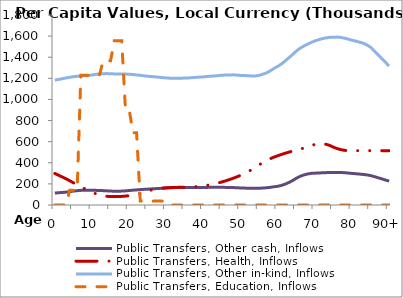
| Category | Public Transfers, Other cash, Inflows | Public Transfers, Health, Inflows | Public Transfers, Other in-kind, Inflows | Public Transfers, Education, Inflows |
|---|---|---|---|---|
| 0 | 113410.724 | 298511.937 | 1182788.728 | 0 |
|  | 116112.495 | 281885.664 | 1189412.381 | 0 |
| 2 | 118814.267 | 265259.391 | 1196036.033 | 0 |
| 3 | 122011.367 | 248444.426 | 1203483.879 | 0 |
| 4 | 126307.316 | 230093.641 | 1210116.266 | 140322.926 |
| 5 | 131666.125 | 210274.482 | 1215534.004 | 140322.926 |
| 6 | 135731.205 | 191416.244 | 1219705.689 | 140322.926 |
| 7 | 138504.505 | 172689.083 | 1222343.809 | 1228600.624 |
| 8 | 140096.441 | 154421.298 | 1224221.126 | 1228600.624 |
| 9 | 140413.207 | 137183.833 | 1227150.554 | 1228600.624 |
| 10 | 139596.475 | 120939.423 | 1231952.092 | 1228600.624 |
| 11 | 138742.312 | 107216.119 | 1237320.927 | 1228600.624 |
| 12 | 137556.727 | 96194.583 | 1241635.04 | 1228600.624 |
| 13 | 136002.239 | 87993.493 | 1243962.849 | 1366098.324 |
| 14 | 134167.024 | 82556.546 | 1244850.68 | 1366098.324 |
| 15 | 131882.488 | 80132.364 | 1243377.073 | 1366098.324 |
| 16 | 130639.744 | 79279.995 | 1241854.962 | 1556804.347 |
| 17 | 130623.009 | 79857.077 | 1241254.008 | 1556804.347 |
| 18 | 131599.822 | 81713.225 | 1240748.784 | 1556804.347 |
| 19 | 133873.671 | 84568.604 | 1240210.032 | 909840.699 |
| 20 | 137139.239 | 88362.67 | 1238986.041 | 909840.699 |
| 21 | 140271.59 | 93944.904 | 1236389.831 | 684817.981 |
| 22 | 142976.066 | 101147.145 | 1231817.637 | 684817.981 |
| 23 | 146102.185 | 109903.458 | 1228517.575 | 36873.275 |
| 24 | 148317.451 | 120285.657 | 1223722.454 | 36873.275 |
| 25 | 150295.268 | 132342.527 | 1219686.375 | 36873.275 |
| 26 | 152534.765 | 142343.503 | 1216716.139 | 36873.275 |
| 27 | 154663.519 | 150397.749 | 1213915.492 | 36873.275 |
| 28 | 156437.338 | 156454.648 | 1210146.995 | 36873.275 |
| 29 | 158700.439 | 160497.763 | 1206845.02 | 36873.275 |
| 30 | 161421.663 | 162613.627 | 1203793.357 | 0 |
| 31 | 163125.882 | 164417.958 | 1201112.638 | 0 |
| 32 | 164869.88 | 165894.227 | 1200504.245 | 0 |
| 33 | 165596.965 | 167049.59 | 1199795.497 | 0 |
| 34 | 165921.549 | 167889.109 | 1200977.939 | 0 |
| 35 | 165540.592 | 168408.067 | 1202965.717 | 0 |
| 36 | 165090.022 | 169621.877 | 1204036.309 | 0 |
| 37 | 164888.122 | 171535.04 | 1206346.174 | 0 |
| 38 | 165170.6 | 174178.375 | 1209286.896 | 0 |
| 39 | 165497.026 | 177540.707 | 1211755.531 | 0 |
| 40 | 165971.02 | 181573.287 | 1213622.569 | 0 |
| 41 | 166838.278 | 186710.087 | 1217484.844 | 0 |
| 42 | 167197.158 | 192992.449 | 1220285.739 | 0 |
| 43 | 167339.951 | 200410.934 | 1222248.778 | 0 |
| 44 | 167652.849 | 208878.953 | 1225882.246 | 0 |
| 45 | 167656.638 | 218479.603 | 1229845.748 | 0 |
| 46 | 166824.4 | 229115.415 | 1230697.228 | 0 |
| 47 | 165787.804 | 240697.005 | 1230905.643 | 0 |
| 48 | 165140.757 | 253172.667 | 1233336.675 | 0 |
| 49 | 163409.702 | 266680.097 | 1230713.023 | 0 |
| 50 | 161494.536 | 281130.369 | 1227518.594 | 0 |
| 51 | 160139.446 | 297224.535 | 1225974.67 | 0 |
| 52 | 159256.04 | 315236.117 | 1224918.159 | 0 |
| 53 | 157976.693 | 335152.525 | 1221901.62 | 0 |
| 54 | 157639.847 | 356834.099 | 1222190.107 | 0 |
| 55 | 158637.304 | 380598.934 | 1228241.378 | 0 |
| 56 | 160690.416 | 402087.52 | 1239020.03 | 0 |
| 57 | 163266.51 | 421513.725 | 1251801.904 | 0 |
| 58 | 167363.79 | 438821.41 | 1270881.253 | 0 |
| 59 | 172426.346 | 453873.795 | 1293887.464 | 0 |
| 60 | 177176.855 | 466610.684 | 1313296.735 | 0 |
| 61 | 185316.853 | 478717.825 | 1335904.124 | 0 |
| 62 | 197582.621 | 490073.201 | 1364630.703 | 0 |
| 63 | 213274.693 | 500696.956 | 1395042.472 | 0 |
| 64 | 231513.299 | 510610.433 | 1424898.969 | 0 |
| 65 | 253355.619 | 519772.593 | 1457778.458 | 0 |
| 66 | 271273.236 | 529475.769 | 1484531.32 | 0 |
| 67 | 284330.587 | 539721.762 | 1505499.233 | 0 |
| 68 | 293724.259 | 550518.96 | 1522962.741 | 0 |
| 69 | 299700.489 | 561878.846 | 1539885.231 | 0 |
| 70 | 301726.906 | 573755.141 | 1554167.537 | 0 |
| 71 | 303200.106 | 580055.861 | 1565484.087 | 0 |
| 72 | 305228.002 | 580569.624 | 1575716.121 | 0 |
| 73 | 306572.027 | 575240.382 | 1583313.774 | 0 |
| 74 | 307959.48 | 564315.411 | 1588067.658 | 0 |
| 75 | 308611.814 | 547788.459 | 1589591.705 | 0 |
| 76 | 308866.376 | 534482.246 | 1590606.437 | 0 |
| 77 | 307844.899 | 524524.115 | 1587198.284 | 0 |
| 78 | 305937.586 | 517934.005 | 1580373.169 | 0 |
| 79 | 302707.104 | 514828.232 | 1571417.436 | 0 |
| 80 | 299148.602 | 514828.232 | 1560829.427 | 0 |
| 81 | 296196.387 | 514828.232 | 1552624.39 | 0 |
| 82 | 293032.36 | 514828.232 | 1543407.298 | 0 |
| 83 | 289612.746 | 514828.232 | 1533455.919 | 0 |
| 84 | 284960.418 | 514828.232 | 1516321.206 | 0 |
| 85 | 279052.527 | 514828.232 | 1495161.951 | 0 |
| 86 | 268984.466 | 514828.232 | 1459546.033 | 0 |
| 87 | 258239.521 | 514828.232 | 1422554.568 | 0 |
| 88 | 247893.826 | 514828.232 | 1388166.31 | 0 |
| 89 | 236840.092 | 514828.232 | 1352097.516 | 0 |
| 90+ | 225786.357 | 514828.232 | 1316028.722 | 0 |